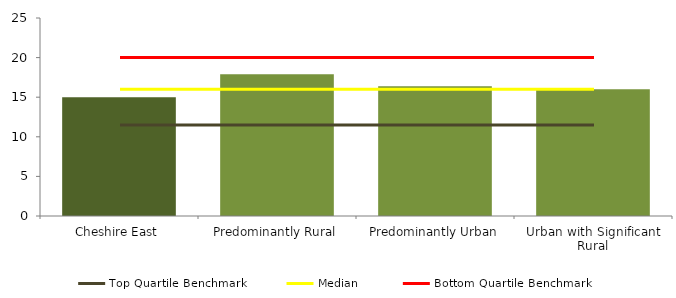
| Category | Series 0 |
|---|---|
| Cheshire East | 15 |
| Predominantly Rural | 17.909 |
| Predominantly Urban | 16.389 |
| Urban with Significant Rural | 16 |